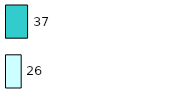
| Category | Series 0 | Series 1 |
|---|---|---|
| 0 | 26 | 37 |